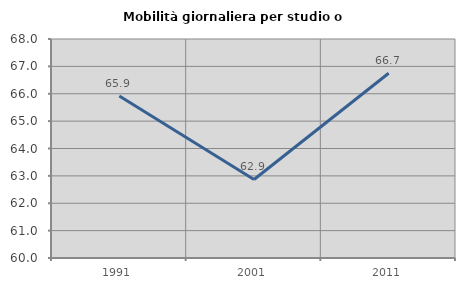
| Category | Mobilità giornaliera per studio o lavoro |
|---|---|
| 1991.0 | 65.916 |
| 2001.0 | 62.869 |
| 2011.0 | 66.748 |